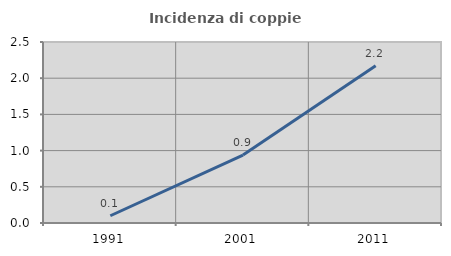
| Category | Incidenza di coppie miste |
|---|---|
| 1991.0 | 0.1 |
| 2001.0 | 0.938 |
| 2011.0 | 2.172 |